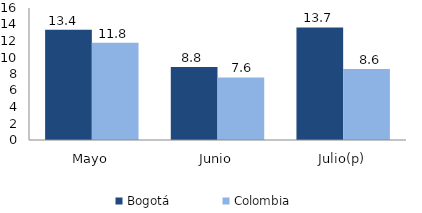
| Category | Bogotá | Colombia |
|---|---|---|
| Mayo | 13.356 | 11.781 |
| Junio | 8.847 | 7.588 |
| Julio(p) | 13.651 | 8.598 |